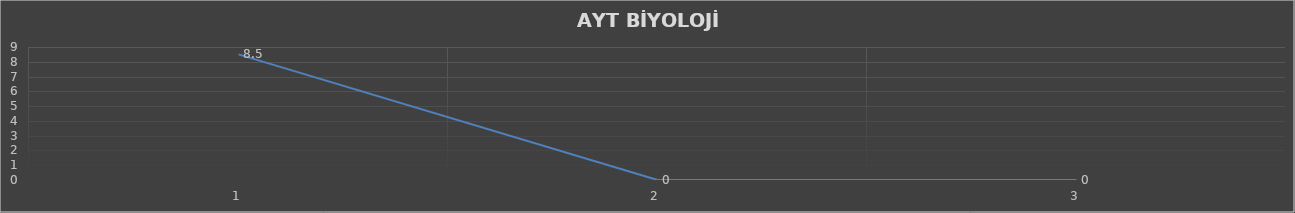
| Category | Series 0 |
|---|---|
| 0 | 8.5 |
| 1 | 0 |
| 2 | 0 |